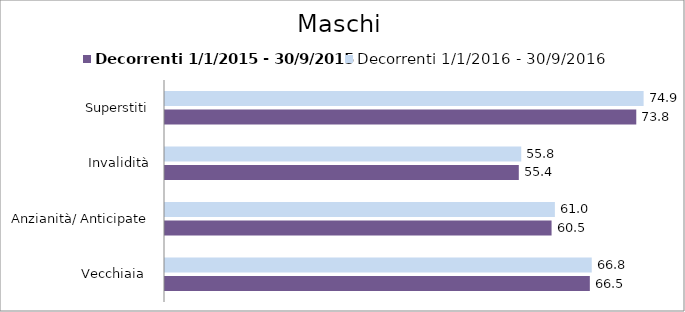
| Category | Decorrenti 1/1/2015 - 30/9/2015 | Decorrenti 1/1/2016 - 30/9/2016 |
|---|---|---|
| Vecchiaia  | 66.51 | 66.81 |
| Anzianità/ Anticipate | 60.52 | 61.04 |
| Invalidità | 55.39 | 55.77 |
| Superstiti | 73.78 | 74.93 |